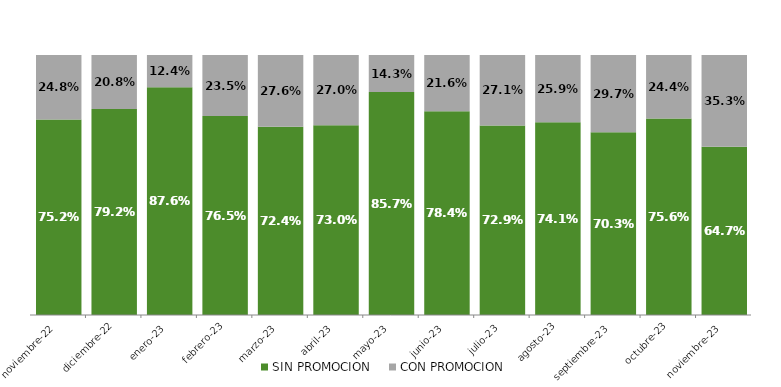
| Category | SIN PROMOCION   | CON PROMOCION   |
|---|---|---|
| 2022-11-01 | 0.752 | 0.248 |
| 2022-12-01 | 0.792 | 0.208 |
| 2023-01-01 | 0.876 | 0.124 |
| 2023-02-01 | 0.765 | 0.235 |
| 2023-03-01 | 0.724 | 0.276 |
| 2023-04-01 | 0.73 | 0.27 |
| 2023-05-01 | 0.857 | 0.143 |
| 2023-06-01 | 0.784 | 0.216 |
| 2023-07-01 | 0.729 | 0.271 |
| 2023-08-01 | 0.741 | 0.259 |
| 2023-09-01 | 0.703 | 0.297 |
| 2023-10-01 | 0.756 | 0.244 |
| 2023-11-01 | 0.647 | 0.353 |